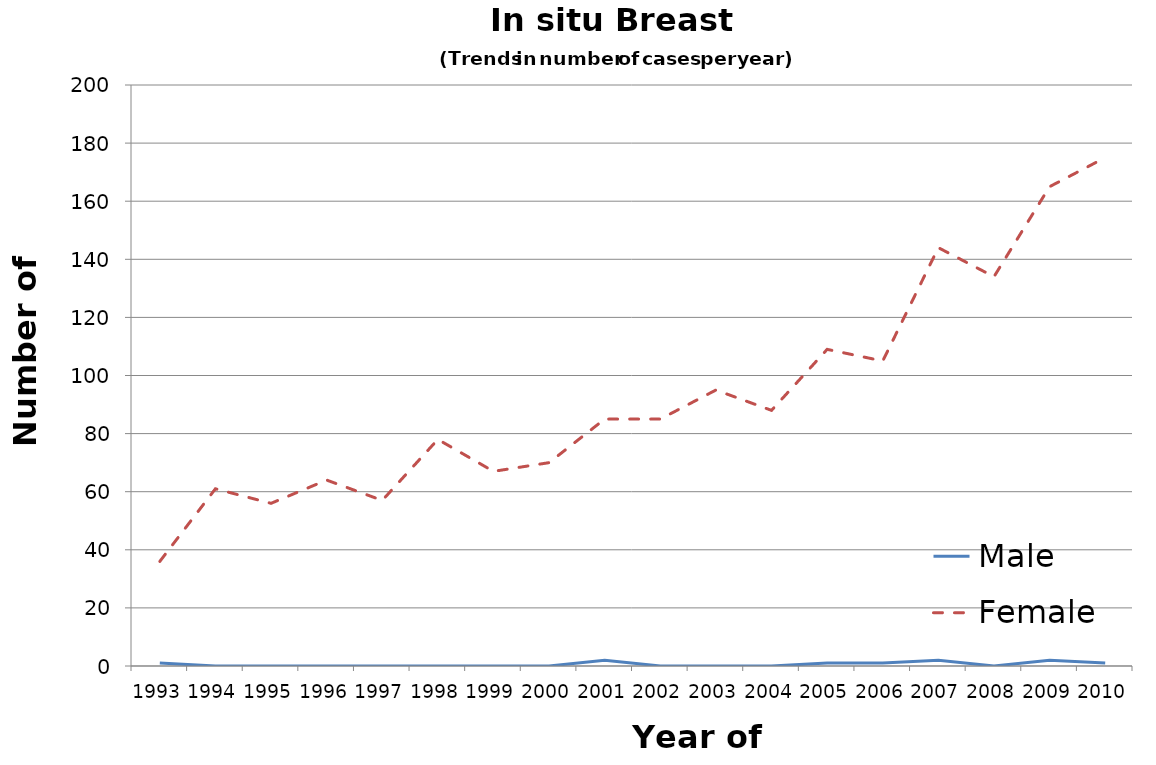
| Category | Male | Female |
|---|---|---|
| 1993.0 | 1 | 36 |
| 1994.0 | 0 | 61 |
| 1995.0 | 0 | 56 |
| 1996.0 | 0 | 64 |
| 1997.0 | 0 | 57 |
| 1998.0 | 0 | 78 |
| 1999.0 | 0 | 67 |
| 2000.0 | 0 | 70 |
| 2001.0 | 2 | 85 |
| 2002.0 | 0 | 85 |
| 2003.0 | 0 | 95 |
| 2004.0 | 0 | 88 |
| 2005.0 | 1 | 109 |
| 2006.0 | 1 | 105 |
| 2007.0 | 2 | 144 |
| 2008.0 | 0 | 134 |
| 2009.0 | 2 | 165 |
| 2010.0 | 1 | 175 |